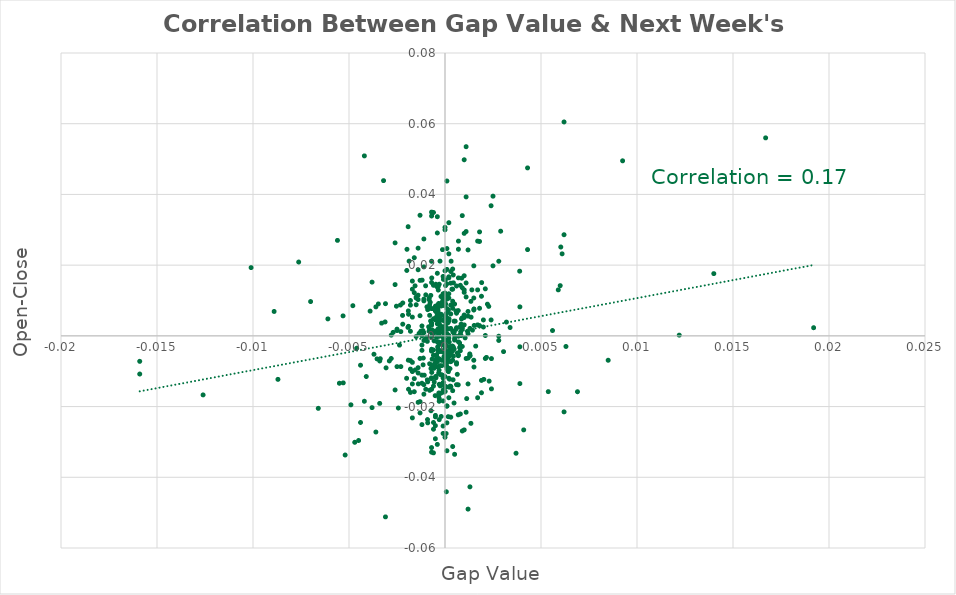
| Category | Series 0 |
|---|---|
| 0.000359999999999915 | 0.013 |
| 0.000109999999999832 | 0 |
| 0.000420000000000087 | 0.009 |
| 0.000150000000000094 | 0.007 |
| -0.000280000000000058 | -0.008 |
| -0.000690000000000079 | -0.01 |
| -0.000159999999999938 | 0.009 |
| -0.000360000000000138 | -0.004 |
| -0.000830000000000108 | 0.01 |
| 0.000179999999999846 | -0.01 |
| 0.000159999999999938 | 0.004 |
| -0.000359999999999915 | 0.007 |
| -0.000370000000000203 | -0.002 |
| 0.000180000000000069 | 0.007 |
| -0.000529999999999919 | -0.008 |
| -0.000129999999999963 | 0.024 |
| -0.000410000000000021 | 0.005 |
| 0.000840000000000173 | 0.003 |
| -5.99999999999489e-05 | -0.001 |
| -0.000690000000000079 | -0.004 |
| -0.000290000000000123 | 0.002 |
| 0.000689999999999857 | -0.014 |
| -0.000369999999999981 | 0.007 |
| -0.000920000000000031 | -0.012 |
| -0.000410000000000021 | -0.009 |
| 2.99999999999744e-05 | -0.014 |
| -0.000299999999999967 | 0.003 |
| -0.00231999999999987 | 0.009 |
| -0.000299999999999967 | 0.005 |
| 0.000760000000000093 | -0.003 |
| -8.000000000008e-05 | 0.016 |
| 0.000209999999999821 | 0.005 |
| 0.000119999999999898 | 0 |
| -0.00114000000000014 | -0.008 |
| -0.000799999999999911 | 0.008 |
| -0.000850000000000017 | 0.003 |
| 0.000260000000000149 | -0.009 |
| -0.000420000000000087 | 0.014 |
| -2.99999999999744e-05 | 0.001 |
| -0.000229999999999952 | -0.004 |
| -0.00312000000000001 | 0.004 |
| 0.00201999999999991 | -0.012 |
| -0.00034999999999985 | 0.001 |
| -0.000319999999999875 | -0.016 |
| -0.000240000000000018 | -0.011 |
| 0.000219999999999887 | -0.002 |
| 0.00136000000000002 | 0.005 |
| 0.000170000000000003 | -0.023 |
| -0.000260000000000149 | 0.021 |
| 0.000269999999999992 | -0.014 |
| -0.00139999999999984 | 0.01 |
| -0.00046999999999997 | -0.012 |
| -0.000729999999999897 | -0.009 |
| 0.000320000000000098 | 0.021 |
| -0.000960000000000071 | 0 |
| 0.000839999999999951 | 0 |
| -0.000410000000000021 | 0.006 |
| -0.000470000000000192 | -0.011 |
| -0.000289999999999901 | 0.004 |
| 0.000149999999999872 | -0.006 |
| -0.000570000000000181 | -0.001 |
| -0.00139000000000022 | -0.014 |
| -0.000909999999999966 | -0.024 |
| 0.000420000000000087 | -0.012 |
| -5.00000000001055e-05 | -0.006 |
| -0.000140000000000029 | -0.002 |
| 0.00046999999999997 | -0.004 |
| -0.00190000000000001 | 0.006 |
| 0.000529999999999919 | 0.004 |
| 0.00113000000000007 | -0.018 |
| -0.000730000000000119 | -0.021 |
| -0.000170000000000003 | -0.008 |
| -0.00134999999999996 | 0.001 |
| 3.00000000001965e-05 | 0.014 |
| 1.00000000000655e-05 | -0.016 |
| 9.99999999999889e-05 | 0.005 |
| 0.0015099999999999 | 0.008 |
| 0.000240000000000018 | -0.012 |
| -0.00191999999999992 | 0.031 |
| 7.00000000000145e-05 | -0.044 |
| 0.00924999999999998 | 0.05 |
| 0.00602999999999998 | 0.025 |
| 0.00134999999999996 | -0.025 |
| -0.00242999999999993 | -0.02 |
| 0.00104999999999999 | -0.001 |
| -0.000210000000000043 | 0.011 |
| -0.000479999999999813 | 0.015 |
| 0.0 | -0.007 |
| 5.99999999999489e-05 | 0.006 |
| 2.0000000000131e-05 | 0.003 |
| 0.000860000000000082 | 0.005 |
| -0.00034999999999985 | 0.002 |
| 0.000150000000000094 | -0.01 |
| 0.000999999999999889 | 0.005 |
| -0.000399999999999955 | -0.006 |
| 0.000460000000000127 | -0.004 |
| -6.0000000000171e-05 | 0 |
| -0.000320000000000098 | 0.003 |
| 0.000269999999999992 | -0.003 |
| 0.0011000000000001 | 0.015 |
| 5.99999999999489e-05 | -0.008 |
| -0.00093999999999994 | 0.008 |
| -0.00016000000000016 | -0.014 |
| 0.000320000000000098 | -0.005 |
| -9.99999999984346e-06 | -0.004 |
| -0.000499999999999944 | 0.007 |
| 1.00000000000655e-05 | 0.005 |
| 1.99999999999089e-05 | -0.005 |
| 0.000259999999999927 | -0.004 |
| 0.000870000000000148 | 0.016 |
| 0.000229999999999952 | -0.005 |
| -0.000130000000000185 | 0.011 |
| -0.00030999999999981 | -0.01 |
| 0.000179999999999846 | 0.002 |
| -0.000329999999999941 | 0.009 |
| 2.99999999999744e-05 | 0.005 |
| -9.99999999999889e-05 | -0.005 |
| -0.000350000000000072 | 0.014 |
| 0.000190000000000134 | 0 |
| -4.99999999998834e-05 | -0.016 |
| -0.000740000000000185 | 0.011 |
| -0.00051000000000001 | -0.017 |
| 0.00046999999999997 | 0.004 |
| 0.000380000000000047 | -0.004 |
| 0.000100000000000211 | 0.008 |
| -0.00337000000000009 | -0.006 |
| 0.000690000000000079 | -0.006 |
| -9.99999999999889e-05 | 0.01 |
| 0.0 | 0.006 |
| 4.000000000004e-05 | -0.008 |
| 0.00081999999999982 | 0.001 |
| -0.000700000000000145 | 0.008 |
| -0.000269999999999992 | 0.002 |
| 0.000170000000000003 | -0.009 |
| 0.00190999999999985 | 0.015 |
| 0.000380000000000047 | -0.003 |
| -1.00000000000655e-05 | -0.004 |
| -0.000199999999999978 | 0.003 |
| -0.00034999999999985 | 0.013 |
| -0.000439999999999995 | -0.005 |
| -0.00034999999999985 | -0.005 |
| -0.000769999999999937 | 0.01 |
| 7.00000000000145e-05 | -0.007 |
| -0.000130000000000185 | 0.004 |
| 0.000159999999999938 | -0.007 |
| -0.000529999999999919 | -0.007 |
| -0.000399999999999955 | 0.009 |
| 0.00304999999999999 | -0.004 |
| 0.000569999999999959 | 0.002 |
| -0.000420000000000087 | 0.008 |
| -0.00154999999999994 | -0.01 |
| 9.99999999984346e-06 | 0.005 |
| -0.000519999999999853 | 0.001 |
| 0.000119999999999898 | 0.011 |
| -0.00192999999999998 | 0.002 |
| 0.000269999999999992 | -0.004 |
| 0.00134999999999996 | 0.01 |
| -0.00100999999999995 | 0.014 |
| -7.00000000000145e-05 | -0.013 |
| -0.000410000000000021 | -0.007 |
| -0.000750000000000028 | 0.004 |
| -0.000559999999999893 | 0.001 |
| -9.99999999997669e-05 | -0.018 |
| -0.00353999999999987 | -0.007 |
| 2.0000000000131e-05 | 0.016 |
| 2.99999999999744e-05 | 0.009 |
| 0.000569999999999959 | 0.007 |
| 0.00042999999999993 | -0.003 |
| -0.000439999999999995 | 0.005 |
| -0.00067000000000017 | -0.007 |
| 0.000759999999999871 | -0.002 |
| -0.00191000000000007 | -0.007 |
| 0.000199999999999978 | 0.016 |
| -0.000149999999999872 | -0.011 |
| 0.00339 | 0.002 |
| 0.0 | 0.012 |
| 0.000430000000000152 | 0.017 |
| -0.000829999999999886 | 0.001 |
| -0.000689999999999857 | 0.016 |
| -0.00156 | 0.014 |
| 0.000189999999999912 | 0.004 |
| 1.00000000000655e-05 | -0.005 |
| 9.99999999999889e-05 | 0.004 |
| -0.000350000000000072 | 0.003 |
| 2.0000000000131e-05 | -0.006 |
| 0.000759999999999871 | 0.002 |
| 0.00151999999999996 | 0.003 |
| -8.000000000008e-05 | -0.003 |
| -0.00081999999999982 | 0.011 |
| -0.000210000000000043 | -0.016 |
| -0.00199000000000015 | 0.018 |
| -0.000379999999999824 | -0.003 |
| 0.00537999999999994 | -0.016 |
| -0.000310000000000032 | -0.002 |
| -0.000329999999999941 | -0.017 |
| -0.00071000000000021 | -0.012 |
| -0.000660000000000104 | 0.002 |
| -0.00347000000000008 | 0.009 |
| -0.000240000000000018 | 0.003 |
| -0.000249999999999861 | -0.014 |
| -0.000559999999999893 | -0.013 |
| 0.000639999999999973 | -0.005 |
| -0.000439999999999995 | 0 |
| -0.00119000000000002 | 0.016 |
| -0.000700000000000145 | 0.003 |
| -0.000580000000000024 | -0.009 |
| -0.00221000000000004 | 0.006 |
| -0.00479999999999991 | 0.009 |
| -0.00236999999999998 | -0.003 |
| -0.00190999999999985 | 0.007 |
| 0.00242000000000008 | -0.015 |
| 0.00228000000000006 | 0.008 |
| -0.000310000000000032 | -0.017 |
| 5.99999999999489e-05 | 0.006 |
| 7.99999999998579e-05 | -0.005 |
| 1.99999999999089e-05 | -0.002 |
| 8.000000000008e-05 | -0.009 |
| 0.00046999999999997 | -0.019 |
| -0.000170000000000003 | -0.007 |
| -0.000369999999999981 | 0.002 |
| 0.000690000000000079 | -0.022 |
| 0.00142999999999982 | 0.002 |
| 0.00117000000000011 | 0.001 |
| -0.00085999999999986 | 0.008 |
| -0.00107999999999997 | -0.011 |
| -0.00114999999999998 | 0.001 |
| 5.99999999999489e-05 | -0.028 |
| 0.00221000000000004 | 0.009 |
| 0.00151000000000012 | -0.009 |
| 0.0191999999999998 | 0.002 |
| 0.000639999999999973 | -0.011 |
| -0.000269999999999992 | -0.002 |
| 0.000689999999999857 | 0.007 |
| 0.00388999999999994 | 0.018 |
| 0.000180000000000069 | -0.006 |
| 0.00129000000000001 | -0.005 |
| -0.00113000000000007 | -0.006 |
| 0.000439999999999995 | -0.006 |
| -0.000539999999999984 | 0.005 |
| -0.00126000000000003 | 0.001 |
| 0.000440000000000218 | 0.015 |
| 0.00241999999999986 | -0.006 |
| 4.000000000004e-05 | 0 |
| -0.0030699999999999 | -0.009 |
| -0.000150000000000094 | -0.011 |
| -5.00000000001055e-05 | -0.002 |
| -0.000280000000000058 | -0.007 |
| -0.000920000000000031 | -0.002 |
| -0.00253000000000014 | 0.008 |
| -0.00530999999999992 | 0.006 |
| 0.00215999999999994 | -0.006 |
| 0.000450000000000061 | 0.001 |
| -0.00198000000000009 | 0.024 |
| -0.00761999999999996 | 0.021 |
| -8.99999999999234e-05 | -0.015 |
| -0.000330000000000163 | -0.01 |
| -0.000199999999999978 | 0.008 |
| -0.00187000000000003 | 0.021 |
| 0.0 | 0.004 |
| 0.000499999999999944 | -0.001 |
| -0.000399999999999955 | -0.007 |
| 0.000399999999999955 | 0.008 |
| 0.000299999999999967 | -0.007 |
| -0.00119999999999986 | 0.003 |
| -0.00140000000000006 | 0.012 |
| 0.000399999999999955 | -0.016 |
| -0.000699999999999922 | -0.008 |
| -9.99999999999889e-05 | 0.009 |
| 9.99999999999889e-05 | -0.02 |
| 0.00150000000000005 | 0.007 |
| 9.99999999999889e-05 | 0.002 |
| -0.000299999999999967 | 0.008 |
| -0.00870000000000015 | -0.012 |
| 0.00609999999999999 | 0.023 |
| -9.99999999999889e-05 | -0.002 |
| -0.0011000000000001 | 0.01 |
| -9.99999999999889e-05 | -0.026 |
| -0.0011000000000001 | 0.01 |
| 0.000499999999999944 | 0.009 |
| -0.000800000000000133 | 0.009 |
| 0.00119999999999986 | 0.006 |
| -0.000500000000000167 | -0.023 |
| 0.00180000000000002 | 0.008 |
| 0.00170000000000003 | 0.013 |
| 0.000800000000000133 | 0 |
| -0.000199999999999978 | -0.023 |
| 9.99999999999889e-05 | 0.01 |
| 0.000199999999999978 | -0.012 |
| -0.00160000000000004 | -0.016 |
| -0.00140000000000006 | -0.009 |
| -0.00140000000000006 | 0.019 |
| -0.00149999999999983 | 0.011 |
| -0.00119999999999986 | -0.011 |
| 9.99999999999889e-05 | -0.032 |
| -0.000600000000000156 | -0.004 |
| 0.00140000000000006 | 0.013 |
| -0.000599999999999933 | 0.001 |
| -0.00370000000000003 | -0.005 |
| -0.000400000000000178 | 0.004 |
| -0.00140000000000006 | -0.011 |
| -0.000999999999999889 | 0.012 |
| -0.000700000000000145 | -0.012 |
| -0.000499999999999944 | -0.029 |
| -0.000599999999999933 | 0.005 |
| -0.00309999999999988 | 0.009 |
| -0.000700000000000145 | -0.004 |
| 0.0028999999999999 | 0.03 |
| -0.00119999999999986 | 0 |
| 0.0008999999999999 | 0.034 |
| 0.000399999999999955 | 0.001 |
| 0.00120000000000009 | -0.014 |
| -0.000399999999999955 | -0.002 |
| -0.00149999999999983 | 0.009 |
| -0.000699999999999922 | 0.003 |
| 0.00170000000000003 | -0.017 |
| -0.000400000000000178 | 0.003 |
| -0.0011000000000001 | 0.019 |
| 0.0008999999999999 | -0.027 |
| 0.0 | -0.015 |
| -0.0011000000000001 | 0.001 |
| 0.000700000000000145 | 0 |
| 0.000299999999999967 | -0.014 |
| -0.00560000000000004 | 0.027 |
| -0.0125999999999999 | -0.017 |
| -0.0159 | -0.011 |
| 0.00279999999999991 | 0.021 |
| -0.00530000000000008 | -0.013 |
| -0.00109999999999987 | -0.016 |
| -0.0008999999999999 | -0.013 |
| -0.000499999999999944 | 0.001 |
| 9.99999999999889e-05 | 0.044 |
| -0.0008999999999999 | -0.025 |
| -9.99999999999889e-05 | -0.002 |
| -0.000699999999999922 | -0.033 |
| 0.00130000000000007 | -0.005 |
| -0.00130000000000007 | -0.022 |
| 0.00249999999999994 | 0.039 |
| -0.000499999999999944 | -0.008 |
| 0.00390000000000001 | -0.003 |
| -0.000600000000000156 | -0.033 |
| -0.000700000000000145 | 0.034 |
| -0.00129999999999985 | 0.034 |
| 0.00150000000000005 | 0.02 |
| 0.0008999999999999 | 0.002 |
| -0.00180000000000002 | -0.009 |
| 0.00279999999999991 | 0 |
| -0.00550000000000006 | -0.013 |
| -0.000700000000000145 | 0.035 |
| 0.00100000000000011 | 0.029 |
| -0.0088999999999999 | 0.007 |
| 0.000299999999999967 | 0.018 |
| -0.000500000000000167 | 0.004 |
| 0.00120000000000009 | 0.024 |
| -0.000299999999999967 | -0.018 |
| 0.000199999999999978 | 0.017 |
| -0.00250000000000016 | -0.009 |
| 0.000800000000000133 | 0.014 |
| 0.00129999999999985 | -0.006 |
| -0.00170000000000003 | 0.005 |
| 0.000100000000000211 | 0.015 |
| -0.000500000000000167 | 0.008 |
| -9.99999999999889e-05 | -0.013 |
| 0.0 | -0.011 |
| -9.99999999999889e-05 | 0.017 |
| 0.000300000000000189 | 0.015 |
| 0.000599999999999933 | 0.014 |
| 0.000499999999999944 | -0.001 |
| -0.000399999999999955 | 0.018 |
| -0.00390000000000001 | 0.007 |
| -0.000700000000000145 | 0.015 |
| -0.000299999999999967 | 0.001 |
| 0.0 | 0.002 |
| 0.0 | 0 |
| 0.000399999999999955 | 0.01 |
| -0.000599999999999933 | 0.008 |
| 9.99999999999889e-05 | -0.001 |
| -0.000299999999999967 | 0.005 |
| -0.000600000000000156 | -0.006 |
| 9.99999999999889e-05 | -0.006 |
| 0.0 | 0.01 |
| 0.000199999999999978 | -0.001 |
| -0.00109999999999987 | -0.001 |
| -0.000199999999999978 | 0.006 |
| -0.000799999999999911 | 0.006 |
| 0.00100000000000011 | 0.012 |
| 0.000900000000000122 | -0.003 |
| -9.99999999999889e-05 | -0.002 |
| -0.00330000000000008 | 0.004 |
| -0.000300000000000189 | -0.019 |
| 0.00100000000000011 | 0.006 |
| 0.000199999999999978 | 0.004 |
| -9.99999999999889e-05 | 0.012 |
| -0.000299999999999967 | -0.004 |
| -0.00410000000000021 | -0.012 |
| -0.000399999999999955 | -0.007 |
| 0.00160000000000004 | -0.003 |
| -0.00170000000000003 | -0.008 |
| -0.000699999999999922 | -0.015 |
| 9.99999999997669e-05 | 0.019 |
| -0.000600000000000156 | -0.014 |
| 0.000399999999999955 | 0.013 |
| 0.000599999999999933 | -0.008 |
| 0.000999999999999889 | 0.017 |
| 9.99999999999889e-05 | -0.008 |
| -0.00129999999999985 | 0.006 |
| 0.000799999999999911 | -0.003 |
| -0.000499999999999944 | -0.012 |
| -0.000699999999999922 | -0.004 |
| 0.0 | -0.006 |
| -0.00109999999999987 | -0.014 |
| 0.000199999999999978 | 0.012 |
| 0.000199999999999978 | 0.032 |
| -9.99999999999889e-05 | -0.012 |
| 0.00190000000000001 | -0.013 |
| 0.000599999999999933 | 0.002 |
| -0.00280000000000013 | -0.006 |
| 0.002 | 0.002 |
| 0.0068999999999999 | -0.016 |
| -0.00119999999999986 | -0.013 |
| -0.000700000000000145 | 0.004 |
| 0.000700000000000145 | 0.016 |
| 0.000799999999999911 | -0.004 |
| -0.00150000000000005 | 0 |
| 0.000199999999999978 | -0.006 |
| 0.000500000000000167 | 0 |
| -9.99999999999889e-05 | -0.014 |
| 0.0011000000000001 | -0.006 |
| -0.00120000000000009 | -0.025 |
| 0.000400000000000178 | 0.019 |
| -0.00180000000000024 | 0.009 |
| 0.000199999999999978 | 0.023 |
| -0.00260000000000015 | -0.015 |
| -0.000499999999999944 | -0.023 |
| 0.00119999999999986 | -0.006 |
| 0.000599999999999933 | -0.008 |
| -0.00170000000000003 | 0.013 |
| 0.0008999999999999 | 0.014 |
| 0.00209999999999999 | -0.006 |
| 0.00240000000000018 | 0.004 |
| 0.000299999999999967 | 0.006 |
| -0.00169999999999981 | -0.014 |
| -0.00130000000000007 | -0.019 |
| -0.00259999999999993 | 0.014 |
| -0.0158999999999998 | -0.007 |
| -0.000799999999999911 | -0.008 |
| -0.000700000000000145 | 0.001 |
| 0.00250000000000016 | 0.02 |
| -0.00130000000000007 | 0.016 |
| 0.00119999999999986 | 0.001 |
| 0.00109999999999987 | 0.03 |
| 0.000199999999999978 | -0.017 |
| -0.000799999999999911 | -0.015 |
| 0.002 | 0.005 |
| 0.00100000000000011 | -0.027 |
| -0.000300000000000189 | 0.015 |
| -0.00120000000000009 | -0.004 |
| 0.000699999999999922 | -0.002 |
| -0.00360000000000004 | -0.027 |
| -0.000199999999999978 | 0.006 |
| -0.000299999999999967 | -0.002 |
| 0.000799999999999911 | -0.022 |
| 0.000100000000000211 | -0.003 |
| -0.00149999999999983 | 0.011 |
| 0.000199999999999978 | 0.011 |
| -0.000399999999999955 | 0.008 |
| 0.000399999999999955 | -0.007 |
| -0.000900000000000122 | 0.007 |
| -0.00140000000000006 | -0.019 |
| 0.0 | 0.012 |
| -0.000599999999999933 | 0.014 |
| -0.000700000000000145 | -0.032 |
| -0.000600000000000156 | -0.024 |
| 9.99999999997669e-05 | -0.006 |
| 0.00189999999999979 | -0.016 |
| 0.0002000000000002 | -0.004 |
| 0.0011000000000001 | 0.011 |
| -0.00229999999999996 | -0.009 |
| -0.00380000000000002 | -0.02 |
| 0.00190000000000001 | 0.011 |
| -0.00229999999999996 | 0.001 |
| 0.0011000000000001 | 0.039 |
| -0.002 | -0.012 |
| 0.00590000000000001 | 0.013 |
| 0.0121999999999999 | 0 |
| -0.00170000000000003 | -0.01 |
| 0.006 | 0.014 |
| -0.00140000000000006 | 0.025 |
| -0.00160000000000004 | 0.012 |
| -0.00699999999999989 | 0.01 |
| -0.00170000000000003 | 0.016 |
| -0.00339999999999984 | -0.007 |
| -0.000999999999999889 | -0.015 |
| 0.000900000000000122 | 0.002 |
| 0.00170000000000003 | 0.027 |
| 0.000299999999999967 | -0.007 |
| 9.99999999997669e-05 | -0.009 |
| -0.00180000000000002 | -0.007 |
| -0.000500000000000167 | 0.007 |
| 0.00180000000000002 | 0.027 |
| 0.00409999999999999 | -0.027 |
| 0.00120000000000009 | 0.007 |
| -0.00439999999999995 | -0.008 |
| 0.000600000000000156 | 0.006 |
| -0.00519999999999987 | -0.034 |
| -0.00449999999999994 | -0.03 |
| -0.00249999999999994 | 0.002 |
| -0.00159999999999982 | 0.022 |
| 0.0 | 0.009 |
| -0.000299999999999967 | 0 |
| -0.000399999999999955 | 0.034 |
| 0.00320000000000009 | 0.004 |
| 0.00850000000000017 | -0.007 |
| -0.0011000000000001 | 0.027 |
| 0.00619999999999998 | 0.029 |
| 0.00390000000000001 | 0.008 |
| -0.000599999999999933 | 0.035 |
| -0.00469999999999992 | -0.03 |
| -0.00119999999999986 | -0.003 |
| 0.00120000000000009 | -0.049 |
| -0.00459999999999993 | -0.003 |
| 0.00209999999999999 | 0.013 |
| -0.0101 | 0.019 |
| -0.00659999999999993 | -0.02 |
| -0.00419999999999998 | 0.051 |
| -0.000399999999999955 | 0.029 |
| -0.00160000000000004 | -0.012 |
| 0.00229999999999996 | -0.013 |
| 0.014 | 0.018 |
| -0.00180000000000002 | 0.01 |
| 0.00280000000000013 | -0.001 |
| -0.00439999999999995 | -0.024 |
| -0.00609999999999999 | 0.005 |
| 0.000699999999999922 | 0.027 |
| 0.000500000000000167 | -0.033 |
| -0.00219999999999998 | 0.009 |
| -0.00250000000000016 | 0.002 |
| -0.00259999999999993 | 0.026 |
| 0.000399999999999955 | -0.031 |
| -0.00339999999999984 | -0.019 |
| -0.0028999999999999 | -0.007 |
| 0.00429999999999997 | 0.024 |
| 0.00100000000000011 | 0.05 |
| 9.99999999999889e-05 | -0.025 |
| -0.00189999999999979 | -0.015 |
| -0.00219999999999998 | 0.003 |
| -0.000499999999999944 | -0.025 |
| -0.00490000000000012 | -0.02 |
| 0.00150000000000005 | 0.011 |
| 0.00619999999999976 | -0.021 |
| 0.000299999999999967 | 0.009 |
| 0.000299999999999967 | -0.023 |
| 0.000699999999999922 | -0.005 |
| -0.00419999999999998 | -0.018 |
| -0.00180000000000002 | 0.001 |
| -0.00279999999999991 | 0 |
| 0.00180000000000024 | 0.003 |
| -0.000299999999999967 | -0.024 |
| -0.00309999999999988 | -0.051 |
| -0.00319999999999987 | 0.044 |
| -0.000599999999999933 | -0.026 |
| -0.000399999999999955 | 0.006 |
| -0.00269999999999992 | 0.001 |
| -0.0037999999999998 | 0.015 |
| 0.00390000000000001 | -0.013 |
| 0.00429999999999997 | 0.047 |
| 0.00170000000000003 | 0.003 |
| 0.00239999999999995 | 0.037 |
| 0.00150000000000005 | -0.007 |
| 0.00130000000000007 | 0.002 |
| 0.00100000000000011 | 0.003 |
| 0.00560000000000004 | 0.002 |
| 0.000599999999999933 | -0.014 |
| -0.000399999999999955 | -0.031 |
| 0.00130000000000007 | -0.043 |
| 0.00370000000000003 | -0.033 |
| -0.000700000000000145 | 0.021 |
| -0.000299999999999967 | -0.014 |
| -0.00130000000000007 | -0.006 |
| 0.0008999999999999 | 0.005 |
| 0.00109999999999987 | 0.053 |
| 0.0011000000000001 | -0.022 |
| -0.00180000000000002 | -0.016 |
| 0.000299999999999967 | 0.002 |
| 0.0 | -0.029 |
| 0.0 | -0.007 |
| 9.99999999999889e-05 | -0.02 |
| 9.99999999999889e-05 | 0.002 |
| -9.99999999999889e-05 | -0.028 |
| 0.0002000000000002 | -0.014 |
| 0.0 | 0.031 |
| 0.0 | 0.03 |
| -0.00170000000000003 | -0.023 |
| 0.0167000000000001 | 0.056 |
| 0.00619999999999998 | 0.06 |
| 0.0 | 0.009 |
| -0.00360000000000004 | 0.008 |
| -0.000100000000000211 | 0 |
| -0.000700000000000145 | 0 |
| 0.00629999999999997 | -0.003 |
| 0.000999999999999889 | 0.013 |
| 0.000699999999999922 | 0.024 |
| 0.000300000000000189 | -0.014 |
| -9.99999999999889e-05 | 0.001 |
| 0.00209999999999999 | 0 |
| -9.99999999999889e-05 | 0.002 |
| -0.00190000000000001 | 0.003 |
| 0.0 | 0.018 |
| 0.00180000000000002 | 0.029 |
| 0.000100000000000211 | 0.025 |
| -0.000800000000000133 | 0.002 |